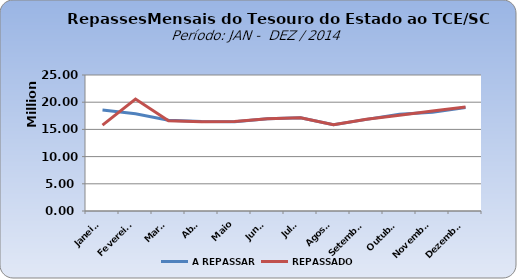
| Category | A REPASSAR | REPASSADO |
|---|---|---|
| Janeiro | 18568165.57 | 15795980.8 |
| Fevereiro | 17875732.96 | 20584045.9 |
| Março | 16678838.4 | 16568327.73 |
| Abril | 16432404.13 | 16425122.99 |
| Maio | 16415160.57 | 16433754.1 |
| Junho | 16943883.55 | 16939465.01 |
| Julho | 17129606.69 | 17127622.2 |
| Agosto | 15857197.64 | 15843490.4 |
| Setembro | 16843819.63 | 16863079.48 |
| Outubro | 17802184.29 | 17585670.96 |
| Novembro | 18166570.77 | 18378383.67 |
| Dezembro | 19024668.31 | 19111665.82 |